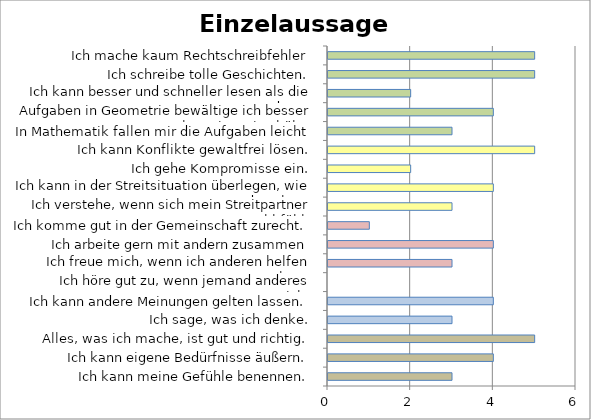
| Category | Series 0 |
|---|---|
| Ich kann meine Gefühle benennen. | 3 |
| Ich kann eigene Bedürfnisse äußern. | 4 |
| Alles, was ich mache, ist gut und richtig. | 5 |
| Ich sage, was ich denke. | 3 |
| Ich kann andere Meinungen gelten lassen. | 4 |
| Ich höre gut zu, wenn jemand anderes spricht. | 0 |
| Ich freue mich, wenn ich anderen helfen kann. | 3 |
| Ich arbeite gern mit andern zusammen | 4 |
| Ich komme gut in der Gemeinschaft zurecht. | 1 |
| Ich verstehe, wenn sich mein Streitpartner unwohl fühlt. | 3 |
| Ich kann in der Streitsituation überlegen, wie es dazu kam. | 4 |
| Ich gehe Kompromisse ein. | 2 |
| Ich kann Konflikte gewaltfrei lösen. | 5 |
| In Mathematik fallen mir die Aufgaben leicht | 3 |
| Aufgaben in Geometrie bewältige ich besser als meine Mitschüler. | 4 |
| Ich kann besser und schneller lesen als die anderen. | 2 |
| Ich schreibe tolle Geschichten. | 5 |
| Ich mache kaum Rechtschreibfehler | 5 |